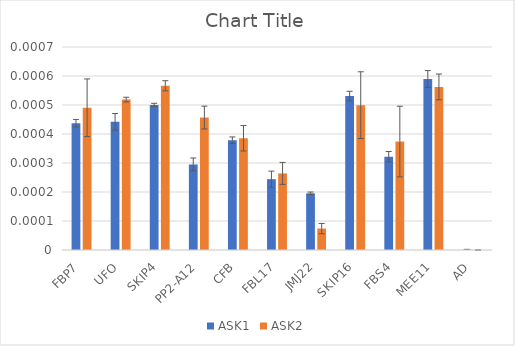
| Category | ASK1 | ASK2 |
|---|---|---|
| FBP7 | 0 | 0 |
| UFO | 0 | 0.001 |
| SKIP4 | 0.001 | 0.001 |
| PP2-A12 | 0 | 0 |
| CFB | 0 | 0 |
| FBL17 | 0 | 0 |
| JMJ22 | 0 | 0 |
| SKIP16 | 0.001 | 0 |
| FBS4 | 0 | 0 |
| MEE11 | 0.001 | 0.001 |
| AD | 0 | 0 |